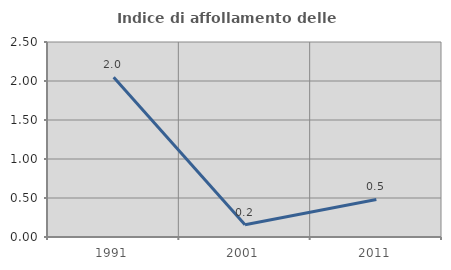
| Category | Indice di affollamento delle abitazioni  |
|---|---|
| 1991.0 | 2.048 |
| 2001.0 | 0.157 |
| 2011.0 | 0.482 |